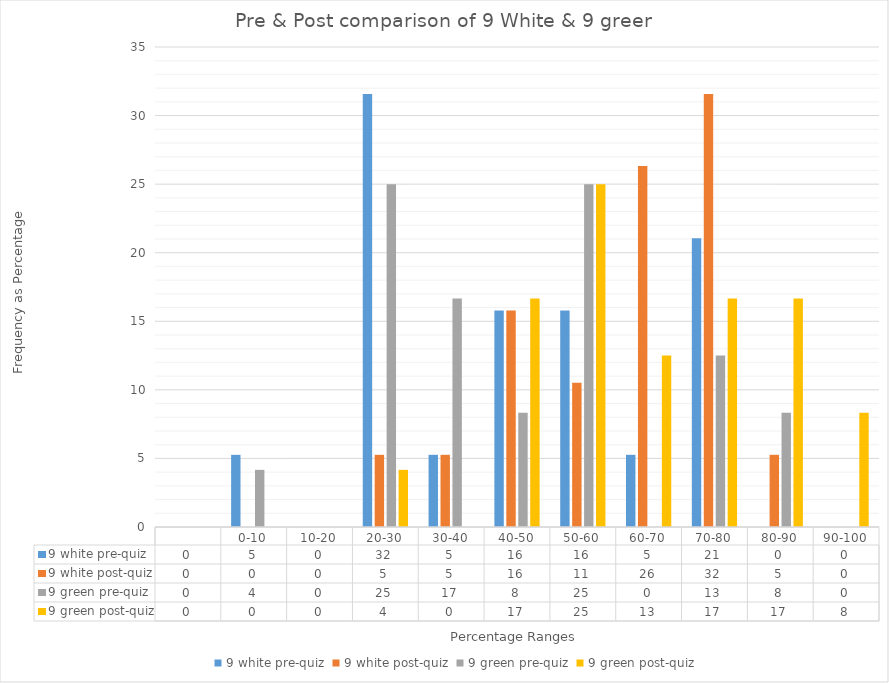
| Category | 9 white pre-quiz | 9 white post-quiz | 9 green pre-quiz | 9 green post-quiz |
|---|---|---|---|---|
|  | 0 | 0 | 0 | 0 |
| 0-10 | 5.263 | 0 | 4.167 | 0 |
| 10-20 | 0 | 0 | 0 | 0 |
| 20-30 | 31.579 | 5.263 | 25 | 4.167 |
| 30-40 | 5.263 | 5.263 | 16.667 | 0 |
| 40-50 | 15.789 | 15.789 | 8.333 | 16.667 |
| 50-60 | 15.789 | 10.526 | 25 | 25 |
| 60-70 | 5.263 | 26.316 | 0 | 12.5 |
| 70-80 | 21.053 | 31.579 | 12.5 | 16.667 |
| 80-90 | 0 | 5.263 | 8.333 | 16.667 |
| 90-100 | 0 | 0 | 0 | 8.333 |